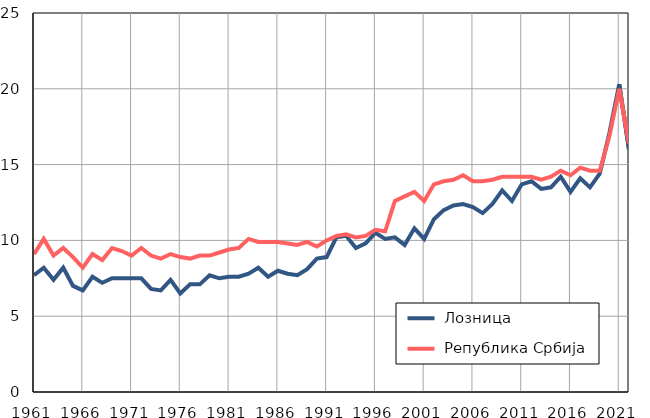
| Category |  Лозница |  Република Србија |
|---|---|---|
| 1961.0 | 7.7 | 9.1 |
| 1962.0 | 8.2 | 10.1 |
| 1963.0 | 7.4 | 9 |
| 1964.0 | 8.2 | 9.5 |
| 1965.0 | 7 | 8.9 |
| 1966.0 | 6.7 | 8.2 |
| 1967.0 | 7.6 | 9.1 |
| 1968.0 | 7.2 | 8.7 |
| 1969.0 | 7.5 | 9.5 |
| 1970.0 | 7.5 | 9.3 |
| 1971.0 | 7.5 | 9 |
| 1972.0 | 7.5 | 9.5 |
| 1973.0 | 6.8 | 9 |
| 1974.0 | 6.7 | 8.8 |
| 1975.0 | 7.4 | 9.1 |
| 1976.0 | 6.5 | 8.9 |
| 1977.0 | 7.1 | 8.8 |
| 1978.0 | 7.1 | 9 |
| 1979.0 | 7.7 | 9 |
| 1980.0 | 7.5 | 9.2 |
| 1981.0 | 7.6 | 9.4 |
| 1982.0 | 7.6 | 9.5 |
| 1983.0 | 7.8 | 10.1 |
| 1984.0 | 8.2 | 9.9 |
| 1985.0 | 7.6 | 9.9 |
| 1986.0 | 8 | 9.9 |
| 1987.0 | 7.8 | 9.8 |
| 1988.0 | 7.7 | 9.7 |
| 1989.0 | 8.1 | 9.9 |
| 1990.0 | 8.8 | 9.6 |
| 1991.0 | 8.9 | 10 |
| 1992.0 | 10.2 | 10.3 |
| 1993.0 | 10.3 | 10.4 |
| 1994.0 | 9.5 | 10.2 |
| 1995.0 | 9.8 | 10.3 |
| 1996.0 | 10.5 | 10.7 |
| 1997.0 | 10.1 | 10.6 |
| 1998.0 | 10.2 | 12.6 |
| 1999.0 | 9.7 | 12.9 |
| 2000.0 | 10.8 | 13.2 |
| 2001.0 | 10.1 | 12.6 |
| 2002.0 | 11.4 | 13.7 |
| 2003.0 | 12 | 13.9 |
| 2004.0 | 12.3 | 14 |
| 2005.0 | 12.4 | 14.3 |
| 2006.0 | 12.2 | 13.9 |
| 2007.0 | 11.8 | 13.9 |
| 2008.0 | 12.4 | 14 |
| 2009.0 | 13.3 | 14.2 |
| 2010.0 | 12.6 | 14.2 |
| 2011.0 | 13.7 | 14.2 |
| 2012.0 | 13.9 | 14.2 |
| 2013.0 | 13.4 | 14 |
| 2014.0 | 13.5 | 14.2 |
| 2015.0 | 14.2 | 14.6 |
| 2016.0 | 13.2 | 14.3 |
| 2017.0 | 14.1 | 14.8 |
| 2018.0 | 13.5 | 14.6 |
| 2019.0 | 14.4 | 14.6 |
| 2020.0 | 17.1 | 16.9 |
| 2021.0 | 20.3 | 20 |
| 2022.0 | 16 | 16.4 |